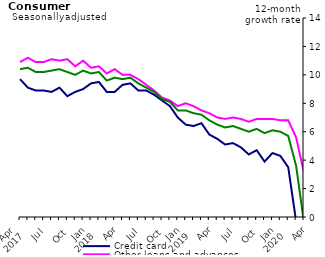
| Category | Credit card | Other loans and advances | Total |
|---|---|---|---|
| Apr 
2017 | 9.7 | 10.9 | 10.4 |
|  | 9.1 | 11.2 | 10.5 |
|  | 8.9 | 10.9 | 10.2 |
| Jul | 8.9 | 10.9 | 10.2 |
|  | 8.8 | 11.1 | 10.3 |
|  | 9.1 | 11 | 10.4 |
| Oct | 8.5 | 11.1 | 10.2 |
|  | 8.8 | 10.6 | 10 |
|  | 9 | 11 | 10.3 |
| Jan 
2018 | 9.4 | 10.5 | 10.1 |
|  | 9.5 | 10.6 | 10.2 |
|  | 8.8 | 10.1 | 9.6 |
| Apr | 8.8 | 10.4 | 9.8 |
|  | 9.3 | 10 | 9.7 |
|  | 9.4 | 10 | 9.8 |
| Jul | 8.9 | 9.7 | 9.4 |
|  | 8.9 | 9.3 | 9.1 |
|  | 8.6 | 8.9 | 8.8 |
| Oct | 8.2 | 8.4 | 8.3 |
|  | 7.8 | 8.2 | 8.1 |
|  | 7 | 7.8 | 7.5 |
| Jan 
2019 | 6.5 | 8 | 7.5 |
|  | 6.4 | 7.8 | 7.3 |
|  | 6.6 | 7.5 | 7.2 |
| Apr | 5.8 | 7.3 | 6.8 |
|  | 5.5 | 7 | 6.5 |
|  | 5.1 | 6.9 | 6.3 |
| Jul | 5.2 | 7 | 6.4 |
|  | 4.9 | 6.9 | 6.2 |
|  | 4.4 | 6.7 | 6 |
| Oct | 4.7 | 6.9 | 6.2 |
|  | 3.9 | 6.9 | 5.9 |
|  | 4.5 | 6.9 | 6.1 |
| Jan 
2020 | 4.3 | 6.8 | 6 |
|  | 3.5 | 6.8 | 5.7 |
|  | -0.3 | 5.6 | 3.6 |
| Apr | -7.8 | 3.1 | -0.4 |